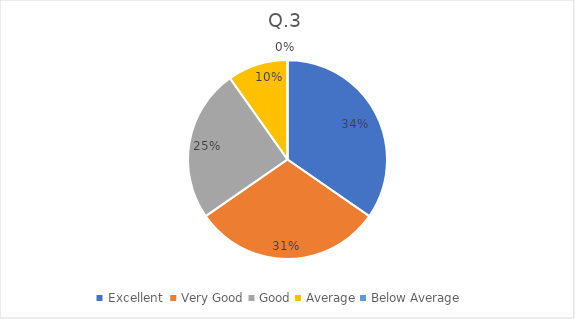
| Category | Series 0 |
|---|---|
| Excellent  | 53 |
| Very Good | 47 |
| Good | 38 |
| Average | 15 |
| Below Average | 0 |